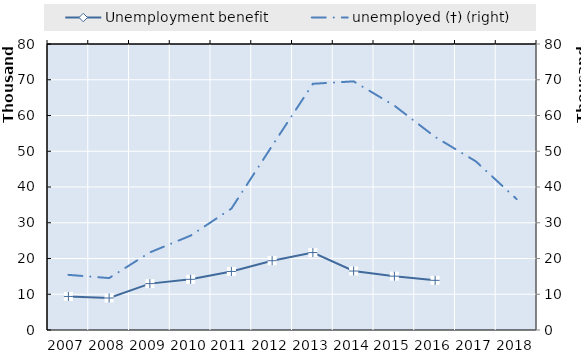
| Category | 0 | Series 14 | Series 15 | Series 16 | Series 17 | Series 18 | Unemployment benefit | Series 1 |
|---|---|---|---|---|---|---|---|---|
| 2007.0 |  |  |  |  |  |  | 9385 |  |
| 2008.0 |  |  |  |  |  |  | 8950 |  |
| 2009.0 |  |  |  |  |  |  | 12973 |  |
| 2010.0 |  |  |  |  |  |  | 14174 |  |
| 2011.0 |  |  |  |  |  |  | 16376 |  |
| 2012.0 |  |  |  |  |  |  | 19388 |  |
| 2013.0 |  |  |  |  |  |  | 21660 |  |
| 2014.0 |  |  |  |  |  |  | 16495 |  |
| 2015.0 |  |  |  |  |  |  | 15060 |  |
| 2016.0 |  |  |  |  |  |  | 13893 |  |
| 2017.0 |  |  |  |  |  |  | 0 |  |
| 2018.0 |  |  |  |  |  |  | 0 |  |